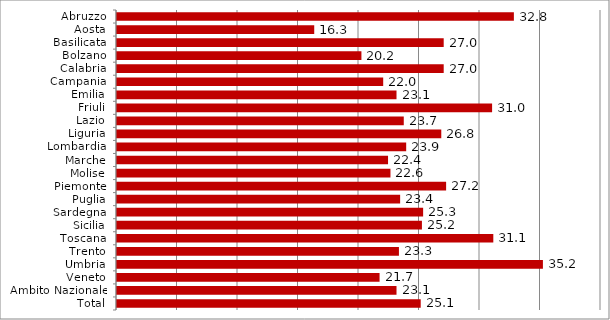
| Category | Series 0 |
|---|---|
| Abruzzo | 32.8 |
| Aosta | 16.3 |
| Basilicata | 27 |
| Bolzano | 20.2 |
| Calabria | 27 |
| Campania | 22 |
| Emilia | 23.1 |
| Friuli | 31 |
| Lazio | 23.7 |
| Liguria | 26.8 |
| Lombardia | 23.9 |
| Marche | 22.4 |
| Molise | 22.6 |
| Piemonte | 27.2 |
| Puglia | 23.4 |
| Sardegna | 25.3 |
| Sicilia | 25.2 |
| Toscana | 31.1 |
| Trento | 23.3 |
| Umbria | 35.2 |
| Veneto | 21.7 |
| Ambito Nazionale | 23.1 |
| Total | 25.1 |